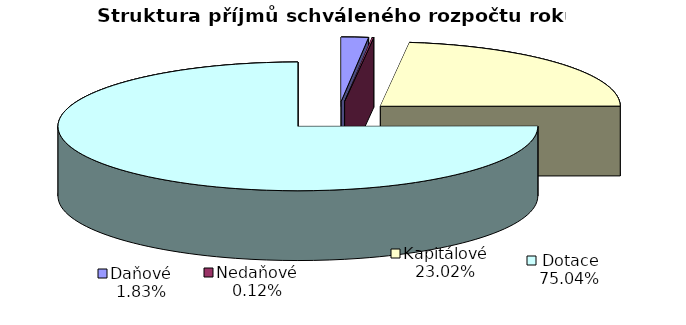
| Category | Schválený rozpočet |
|---|---|
| Daňové | 1586 |
| Nedaňové | 100 |
| Kapitálové | 20000 |
| Dotace | 65203 |